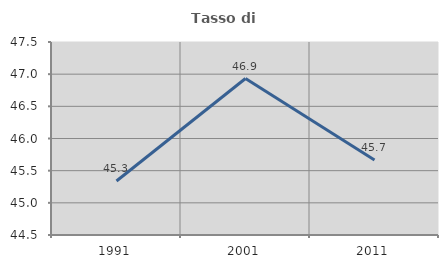
| Category | Tasso di occupazione   |
|---|---|
| 1991.0 | 45.339 |
| 2001.0 | 46.932 |
| 2011.0 | 45.666 |